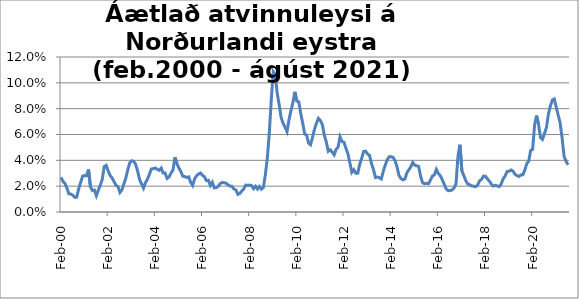
| Category | Series 0 |
|---|---|
| 2000-02-01 | 0.027 |
| 2000-03-01 | 0.024 |
| 2000-04-01 | 0.022 |
| 2000-05-01 | 0.019 |
| 2000-06-01 | 0.014 |
| 2000-07-01 | 0.014 |
| 2000-08-01 | 0.013 |
| 2000-09-01 | 0.011 |
| 2000-10-01 | 0.011 |
| 2000-11-01 | 0.018 |
| 2000-12-01 | 0.023 |
| 2001-01-01 | 0.028 |
| 2001-02-01 | 0.028 |
| 2001-03-01 | 0.028 |
| 2001-04-01 | 0.033 |
| 2001-05-01 | 0.019 |
| 2001-06-01 | 0.017 |
| 2001-07-01 | 0.017 |
| 2001-08-01 | 0.013 |
| 2001-09-01 | 0.017 |
| 2001-10-01 | 0.021 |
| 2001-11-01 | 0.025 |
| 2001-12-01 | 0.035 |
| 2002-01-01 | 0.036 |
| 2002-02-01 | 0.032 |
| 2002-03-01 | 0.028 |
| 2002-04-01 | 0.026 |
| 2002-05-01 | 0.024 |
| 2002-06-01 | 0.021 |
| 2002-07-01 | 0.02 |
| 2002-08-01 | 0.015 |
| 2002-09-01 | 0.017 |
| 2002-10-01 | 0.022 |
| 2002-11-01 | 0.026 |
| 2002-12-01 | 0.033 |
| 2003-01-01 | 0.038 |
| 2003-02-01 | 0.04 |
| 2003-03-01 | 0.039 |
| 2003-04-01 | 0.037 |
| 2003-05-01 | 0.032 |
| 2003-06-01 | 0.025 |
| 2003-07-01 | 0.022 |
| 2003-08-01 | 0.018 |
| 2003-09-01 | 0.023 |
| 2003-10-01 | 0.025 |
| 2003-11-01 | 0.029 |
| 2003-12-01 | 0.033 |
| 2004-01-01 | 0.034 |
| 2004-02-01 | 0.034 |
| 2004-03-01 | 0.033 |
| 2004-04-01 | 0.032 |
| 2004-05-01 | 0.034 |
| 2004-06-01 | 0.03 |
| 2004-07-01 | 0.03 |
| 2004-08-01 | 0.026 |
| 2004-09-01 | 0.027 |
| 2004-10-01 | 0.03 |
| 2004-11-01 | 0.033 |
| 2004-12-01 | 0.042 |
| 2005-01-01 | 0.037 |
| 2005-02-01 | 0.034 |
| 2005-03-01 | 0.031 |
| 2005-04-01 | 0.028 |
| 2005-05-01 | 0.027 |
| 2005-06-01 | 0.027 |
| 2005-07-01 | 0.027 |
| 2005-08-01 | 0.023 |
| 2005-09-01 | 0.021 |
| 2005-10-01 | 0.026 |
| 2005-11-01 | 0.028 |
| 2005-12-01 | 0.029 |
| 2006-01-01 | 0.03 |
| 2006-02-01 | 0.028 |
| 2006-03-01 | 0.027 |
| 2006-04-01 | 0.024 |
| 2006-05-01 | 0.025 |
| 2006-06-01 | 0.021 |
| 2006-07-01 | 0.023 |
| 2006-08-01 | 0.019 |
| 2006-09-01 | 0.019 |
| 2006-10-01 | 0.02 |
| 2006-11-01 | 0.022 |
| 2006-12-01 | 0.023 |
| 2007-01-01 | 0.023 |
| 2007-02-01 | 0.022 |
| 2007-03-01 | 0.021 |
| 2007-04-01 | 0.02 |
| 2007-05-01 | 0.02 |
| 2007-06-01 | 0.018 |
| 2007-07-01 | 0.017 |
| 2007-08-01 | 0.014 |
| 2007-09-01 | 0.014 |
| 2007-10-01 | 0.016 |
| 2007-11-01 | 0.018 |
| 2007-12-01 | 0.021 |
| 2008-01-01 | 0.021 |
| 2008-02-01 | 0.021 |
| 2008-03-01 | 0.02 |
| 2008-04-01 | 0.018 |
| 2008-05-01 | 0.02 |
| 2008-06-01 | 0.018 |
| 2008-07-01 | 0.02 |
| 2008-08-01 | 0.018 |
| 2008-09-01 | 0.019 |
| 2008-10-01 | 0.029 |
| 2008-11-01 | 0.042 |
| 2008-12-01 | 0.061 |
| 2009-01-01 | 0.087 |
| 2009-02-01 | 0.109 |
| 2009-03-01 | 0.106 |
| 2009-04-01 | 0.092 |
| 2009-05-01 | 0.083 |
| 2009-06-01 | 0.073 |
| 2009-07-01 | 0.069 |
| 2009-08-01 | 0.066 |
| 2009-09-01 | 0.062 |
| 2009-10-01 | 0.071 |
| 2009-11-01 | 0.078 |
| 2009-12-01 | 0.085 |
| 2010-01-01 | 0.093 |
| 2010-02-01 | 0.086 |
| 2010-03-01 | 0.085 |
| 2010-04-01 | 0.076 |
| 2010-05-01 | 0.069 |
| 2010-06-01 | 0.06 |
| 2010-07-01 | 0.059 |
| 2010-08-01 | 0.053 |
| 2010-09-01 | 0.052 |
| 2010-10-01 | 0.058 |
| 2010-11-01 | 0.064 |
| 2010-12-01 | 0.069 |
| 2011-01-01 | 0.072 |
| 2011-02-01 | 0.071 |
| 2011-03-01 | 0.068 |
| 2011-04-01 | 0.059 |
| 2011-05-01 | 0.054 |
| 2011-06-01 | 0.047 |
| 2011-07-01 | 0.048 |
| 2011-08-01 | 0.046 |
| 2011-09-01 | 0.044 |
| 2011-10-01 | 0.049 |
| 2011-11-01 | 0.05 |
| 2011-12-01 | 0.058 |
| 2012-01-01 | 0.055 |
| 2012-02-01 | 0.054 |
| 2012-03-01 | 0.049 |
| 2012-04-01 | 0.045 |
| 2012-05-01 | 0.038 |
| 2012-06-01 | 0.031 |
| 2012-07-01 | 0.033 |
| 2012-08-01 | 0.03 |
| 2012-09-01 | 0.03 |
| 2012-10-01 | 0.037 |
| 2012-11-01 | 0.042 |
| 2012-12-01 | 0.047 |
| 2013-01-01 | 0.047 |
| 2013-02-01 | 0.045 |
| 2013-03-01 | 0.044 |
| 2013-04-01 | 0.037 |
| 2013-05-01 | 0.033 |
| 2013-06-01 | 0.027 |
| 2013-07-01 | 0.027 |
| 2013-08-01 | 0.027 |
| 2013-09-01 | 0.026 |
| 2013-10-01 | 0.032 |
| 2013-11-01 | 0.036 |
| 2013-12-01 | 0.04 |
| 2014-01-01 | 0.043 |
| 2014-02-01 | 0.043 |
| 2014-03-01 | 0.042 |
| 2014-04-01 | 0.04 |
| 2014-05-01 | 0.035 |
| 2014-06-01 | 0.028 |
| 2014-07-01 | 0.026 |
| 2014-08-01 | 0.025 |
| 2014-09-01 | 0.026 |
| 2014-10-01 | 0.03 |
| 2014-11-01 | 0.033 |
| 2014-12-01 | 0.035 |
| 2015-01-01 | 0.038 |
| 2015-02-01 | 0.036 |
| 2015-03-01 | 0.036 |
| 2015-04-01 | 0.035 |
| 2015-05-01 | 0.028 |
| 2015-06-01 | 0.023 |
| 2015-07-01 | 0.022 |
| 2015-08-01 | 0.022 |
| 2015-09-01 | 0.022 |
| 2015-10-01 | 0.025 |
| 2015-11-01 | 0.028 |
| 2015-12-01 | 0.029 |
| 2016-01-01 | 0.033 |
| 2016-02-01 | 0.03 |
| 2016-03-01 | 0.028 |
| 2016-04-01 | 0.025 |
| 2016-05-01 | 0.021 |
| 2016-06-01 | 0.018 |
| 2016-07-01 | 0.016 |
| 2016-08-01 | 0.017 |
| 2016-09-01 | 0.017 |
| 2016-10-01 | 0.019 |
| 2016-11-01 | 0.022 |
| 2016-12-01 | 0.043 |
| 2017-01-01 | 0.052 |
| 2017-02-01 | 0.032 |
| 2017-03-01 | 0.028 |
| 2017-04-01 | 0.024 |
| 2017-05-01 | 0.022 |
| 2017-06-01 | 0.021 |
| 2017-07-01 | 0.02 |
| 2017-08-01 | 0.02 |
| 2017-09-01 | 0.02 |
| 2017-10-01 | 0.021 |
| 2017-11-01 | 0.024 |
| 2017-12-01 | 0.025 |
| 2018-01-01 | 0.028 |
| 2018-02-01 | 0.028 |
| 2018-03-01 | 0.026 |
| 2018-04-01 | 0.024 |
| 2018-05-01 | 0.022 |
| 2018-06-01 | 0.02 |
| 2018-07-01 | 0.021 |
| 2018-08-01 | 0.02 |
| 2018-09-01 | 0.02 |
| 2018-10-01 | 0.022 |
| 2018-11-01 | 0.026 |
| 2018-12-01 | 0.028 |
| 2019-01-01 | 0.031 |
| 2019-02-01 | 0.032 |
| 2019-03-01 | 0.033 |
| 2019-04-01 | 0.032 |
| 2019-05-01 | 0.029 |
| 2019-06-01 | 0.028 |
| 2019-07-01 | 0.027 |
| 2019-08-01 | 0.029 |
| 2019-09-01 | 0.029 |
| 2019-10-01 | 0.032 |
| 2019-11-01 | 0.037 |
| 2019-12-01 | 0.039 |
| 2020-01-01 | 0.048 |
| 2020-02-01 | 0.048 |
| 2020-03-01 | 0.068 |
| 2020-04-01 | 0.075 |
| 2020-05-01 | 0.068 |
| 2020-06-01 | 0.058 |
| 2020-07-01 | 0.056 |
| 2020-08-01 | 0.061 |
| 2020-09-01 | 0.065 |
| 2020-10-01 | 0.076 |
| 2020-11-01 | 0.082 |
| 2020-12-01 | 0.087 |
| 2021-01-01 | 0.087 |
| 2021-02-01 | 0.081 |
| 2021-03-01 | 0.075 |
| 2021-04-01 | 0.069 |
| 2021-05-01 | 0.057 |
| 2021-06-01 | 0.043 |
| 2021-07-01 | 0.039 |
| 2021-08-01 | 0.036 |